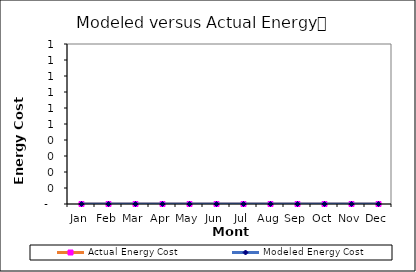
| Category | Actual Energy Cost | Modeled Energy Cost |
|---|---|---|
| 0 | 0 | 0 |
| 1900-01-01 | 0 | 0 |
| 1900-01-02 | 0 | 0 |
| 1900-01-03 | 0 | 0 |
| 1900-01-04 | 0 | 0 |
| 1900-01-05 | 0 | 0 |
| 1900-01-06 | 0 | 0 |
| 1900-01-07 | 0 | 0 |
| 1900-01-08 | 0 | 0 |
| 1900-01-09 | 0 | 0 |
| 1900-01-10 | 0 | 0 |
| 1900-01-11 | 0 | 0 |